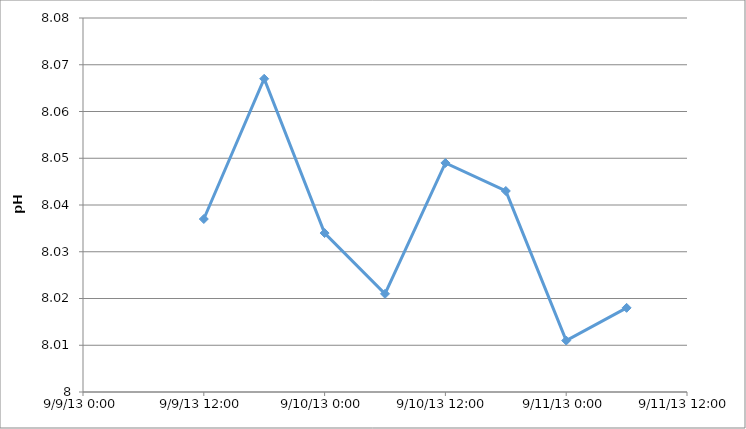
| Category | Series 0 |
|---|---|
| 41526.5 | 8.037 |
| 41526.75 | 8.067 |
| 41527.0 | 8.034 |
| 41527.25 | 8.021 |
| 41527.5 | 8.049 |
| 41527.75 | 8.043 |
| 41528.0 | 8.011 |
| 41528.25 | 8.018 |